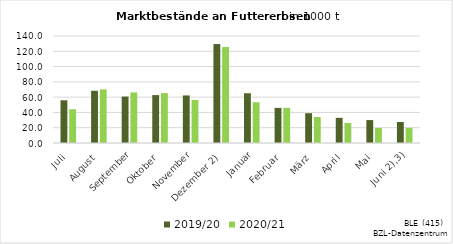
| Category | 2019/20 | 2020/21 |
|---|---|---|
| Juli | 55.883 | 44.193 |
| August | 68.289 | 70.173 |
| September | 60.772 | 66.157 |
| Oktober | 62.687 | 65.311 |
| November | 62.228 | 56.221 |
|  Dezember 2) | 129.423 | 125.646 |
| Januar | 65.097 | 53.347 |
| Februar | 45.944 | 46.052 |
| März | 39.019 | 34.058 |
| April | 32.898 | 26.202 |
| Mai | 30.009 | 19.612 |
|    Juni 2),3) | 27.49 | 19.808 |